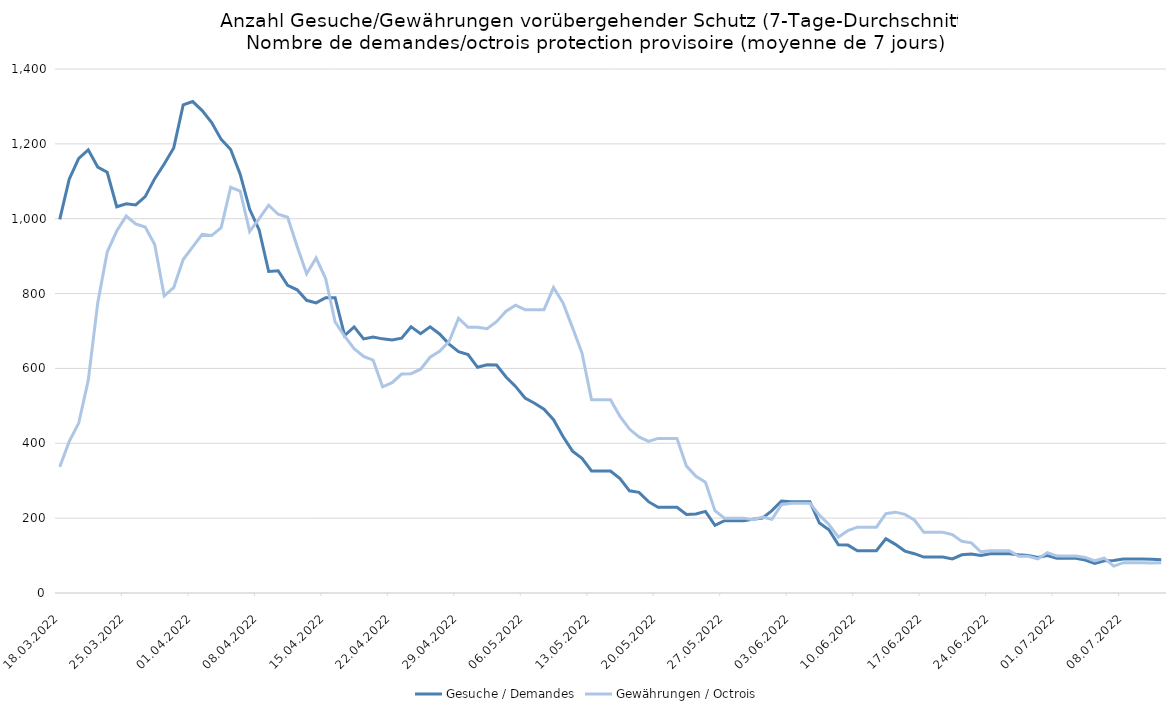
| Category | Gesuche / Demandes | Gewährungen / Octrois |
|---|---|---|
| 2022-03-18 | 998 | 337 |
| 2022-03-19 | 1106 | 405 |
| 2022-03-20 | 1161 | 454 |
| 2022-03-21 | 1184 | 568 |
| 2022-03-22 | 1138 | 775 |
| 2022-03-23 | 1124 | 911 |
| 2022-03-24 | 1032 | 967 |
| 2022-03-25 | 1040 | 1007 |
| 2022-03-26 | 1037 | 986 |
| 2022-03-27 | 1059 | 978 |
| 2022-03-28 | 1107 | 931 |
| 2022-03-29 | 1146 | 794 |
| 2022-03-30 | 1189 | 816 |
| 2022-03-31 | 1304 | 891 |
| 2022-04-01 | 1313 | 925 |
| 2022-04-02 | 1289 | 958 |
| 2022-04-03 | 1257 | 955 |
| 2022-04-04 | 1212 | 976 |
| 2022-04-05 | 1185 | 1084 |
| 2022-04-06 | 1119 | 1074 |
| 2022-04-07 | 1025 | 966 |
| 2022-04-08 | 970 | 1000 |
| 2022-04-09 | 859 | 1036 |
| 2022-04-10 | 861 | 1012 |
| 2022-04-11 | 822 | 1004 |
| 2022-04-12 | 810 | 926 |
| 2022-04-13 | 782 | 853 |
| 2022-04-14 | 775 | 895 |
| 2022-04-15 | 789 | 840 |
| 2022-04-16 | 789 | 724 |
| 2022-04-17 | 688 | 686 |
| 2022-04-18 | 711 | 653 |
| 2022-04-19 | 679 | 632 |
| 2022-04-20 | 684 | 622 |
| 2022-04-21 | 679 | 551 |
| 2022-04-22 | 676 | 562 |
| 2022-04-23 | 681 | 585 |
| 2022-04-24 | 711 | 586 |
| 2022-04-25 | 693 | 598 |
| 2022-04-26 | 711 | 630 |
| 2022-04-27 | 692 | 646 |
| 2022-04-28 | 665 | 672 |
| 2022-04-29 | 645 | 734 |
| 2022-04-30 | 637 | 710 |
| 2022-05-01 | 603 | 710 |
| 2022-05-02 | 610 | 706 |
| 2022-05-03 | 609 | 725 |
| 2022-05-04 | 577 | 753 |
| 2022-05-05 | 552 | 769 |
| 2022-05-06 | 521 | 757 |
| 2022-05-07 | 507 | 757 |
| 2022-05-08 | 491 | 757 |
| 2022-05-09 | 463 | 816 |
| 2022-05-10 | 418 | 775 |
| 2022-05-11 | 379 | 709 |
| 2022-05-12 | 360 | 641 |
| 2022-05-13 | 326 | 516 |
| 2022-05-14 | 326 | 516 |
| 2022-05-15 | 326 | 516 |
| 2022-05-16 | 306 | 472 |
| 2022-05-17 | 273 | 438 |
| 2022-05-18 | 269 | 417 |
| 2022-05-19 | 244 | 405 |
| 2022-05-20 | 229 | 413 |
| 2022-05-21 | 229 | 413 |
| 2022-05-22 | 229 | 413 |
| 2022-05-23 | 210 | 339 |
| 2022-05-24 | 211 | 312 |
| 2022-05-25 | 218 | 296 |
| 2022-05-26 | 181 | 220 |
| 2022-05-27 | 193 | 200 |
| 2022-05-28 | 193 | 200 |
| 2022-05-29 | 193 | 200 |
| 2022-05-30 | 197 | 196 |
| 2022-05-31 | 200 | 203 |
| 2022-06-01 | 220 | 197 |
| 2022-06-02 | 246 | 236 |
| 2022-06-03 | 244 | 240 |
| 2022-06-04 | 244 | 240 |
| 2022-06-05 | 244 | 240 |
| 2022-06-06 | 187 | 208 |
| 2022-06-07 | 169 | 183 |
| 2022-06-08 | 129 | 149 |
| 2022-06-09 | 128 | 167 |
| 2022-06-10 | 113 | 176 |
| 2022-06-11 | 113 | 176 |
| 2022-06-12 | 113 | 176 |
| 2022-06-13 | 145 | 212 |
| 2022-06-14 | 130 | 216 |
| 2022-06-15 | 112 | 210 |
| 2022-06-16 | 105 | 195 |
| 2022-06-17 | 96 | 162 |
| 2022-06-18 | 96 | 162 |
| 2022-06-19 | 96 | 162 |
| 2022-06-20 | 91 | 156 |
| 2022-06-21 | 102 | 138 |
| 2022-06-22 | 104 | 134 |
| 2022-06-23 | 100 | 110 |
| 2022-06-24 | 105 | 113 |
| 2022-06-25 | 105 | 113 |
| 2022-06-26 | 105 | 113 |
| 2022-06-27 | 102 | 98 |
| 2022-06-28 | 100 | 98 |
| 2022-06-29 | 95 | 91 |
| 2022-06-30 | 100 | 108 |
| 2022-07-01 | 93 | 99 |
| 2022-07-02 | 93 | 99 |
| 2022-07-03 | 93 | 99 |
| 2022-07-04 | 88 | 95 |
| 2022-07-05 | 79 | 86 |
| 2022-07-06 | 86 | 93 |
| 2022-07-07 | 87 | 72 |
| 2022-07-08 | 91 | 81 |
| 2022-07-09 | 91 | 81 |
| 2022-07-10 | 91 | 81 |
| 2022-07-11 | 90 | 80 |
| 2022-07-12 | 89 | 81 |